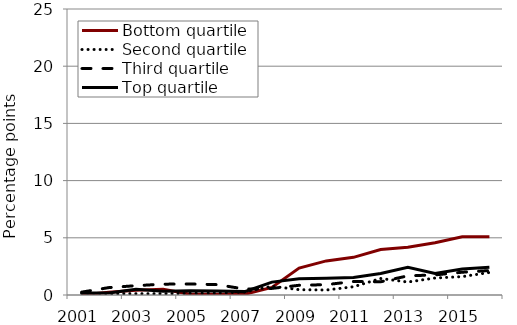
| Category | Bottom quartile | Second quartile | Third quartile | Top quartile |
|---|---|---|---|---|
| 2001.0 | 0 | 0.148 | 0.25 | 0.164 |
| 2002.0 | 0.233 | 0.121 | 0.647 | 0.181 |
| 2003.0 | 0.425 | 0.118 | 0.816 | 0.495 |
| 2004.0 | 0.504 | 0.117 | 0.947 | 0.332 |
| 2005.0 | 0.067 | 0.152 | 0.962 | 0.382 |
| 2006.0 | 0.067 | 0.171 | 0.906 | 0.35 |
| 2007.0 | 0.062 | 0.262 | 0.517 | 0.295 |
| 2008.0 | 0.667 | 0.765 | 0.577 | 1.125 |
| 2009.0 | 2.358 | 0.468 | 0.849 | 1.415 |
| 2010.0 | 2.98 | 0.434 | 0.904 | 1.471 |
| 2011.0 | 3.291 | 0.721 | 1.181 | 1.536 |
| 2012.0 | 3.976 | 1.443 | 1.156 | 1.872 |
| 2013.0 | 4.175 | 1.133 | 1.673 | 2.413 |
| 2014.0 | 4.568 | 1.483 | 1.758 | 1.878 |
| 2015.0 | 5.099 | 1.607 | 1.99 | 2.265 |
| 2016.0 | 5.094 | 1.968 | 2.136 | 2.417 |